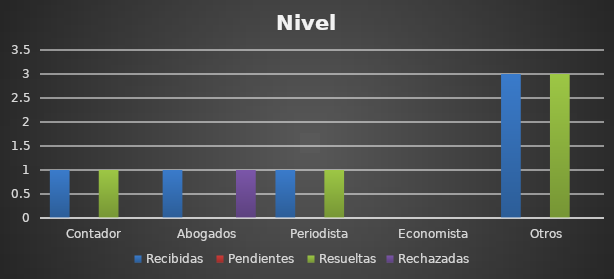
| Category | Recibidas  | Pendientes  | Resueltas | Rechazadas  |
|---|---|---|---|---|
| Contador | 1 | 0 | 1 | 0 |
| Abogados | 1 | 0 | 0 | 1 |
| Periodista | 1 | 0 | 1 | 0 |
| Economista | 0 | 0 | 0 | 0 |
| Otros | 3 | 0 | 3 | 0 |